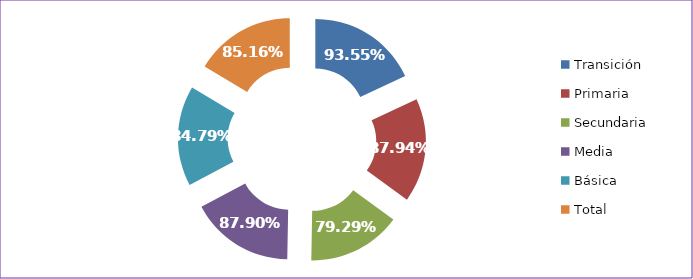
| Category | Tasa Aprobación |
|---|---|
| Transición | 0.936 |
| Primaria | 0.879 |
| Secundaria | 0.793 |
| Media | 0.879 |
| Básica | 0.848 |
| Total | 0.852 |